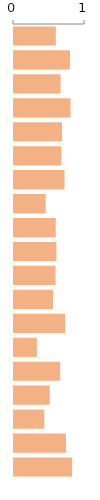
| Category | Score |
|---|---|
| 0 | 0.589 |
| 1 | 0.788 |
| 2 | 0.656 |
| 3 | 0.796 |
| 4 | 0.675 |
| 5 | 0.669 |
| 6 | 0.712 |
| 7 | 0.446 |
| 8 | 0.588 |
| 9 | 0.597 |
| 10 | 0.584 |
| 11 | 0.55 |
| 12 | 0.72 |
| 13 | 0.322 |
| 14 | 0.65 |
| 15 | 0.504 |
| 16 | 0.427 |
| 17 | 0.732 |
| 18 | 0.818 |